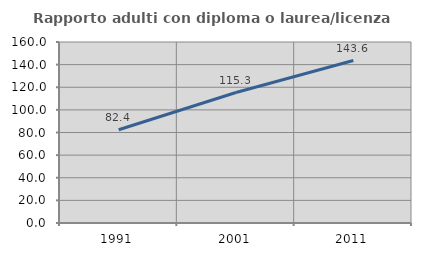
| Category | Rapporto adulti con diploma o laurea/licenza media  |
|---|---|
| 1991.0 | 82.386 |
| 2001.0 | 115.315 |
| 2011.0 | 143.643 |